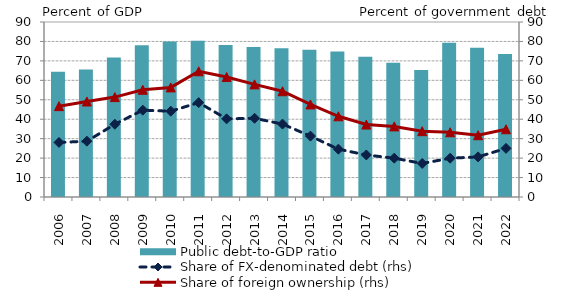
| Category | Public debt-to-GDP ratio |
|---|---|
| 2006.0 | 64.407 |
| 2007.0 | 65.531 |
| 2008.0 | 71.735 |
| 2009.0 | 78.005 |
| 2010.0 | 79.973 |
| 2011.0 | 80.306 |
| 2012.0 | 78.129 |
| 2013.0 | 77.171 |
| 2014.0 | 76.517 |
| 2015.0 | 75.739 |
| 2016.0 | 74.835 |
| 2017.0 | 72.114 |
| 2018.0 | 69.078 |
| 2019.0 | 65.346 |
| 2020.0 | 79.276 |
| 2021.0 | 76.771 |
| 2022.0 | 73.569 |